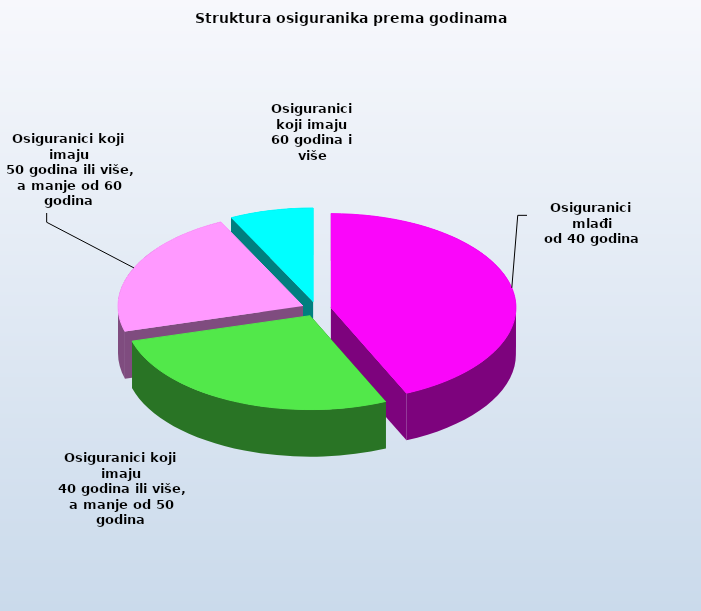
| Category | Series 0 |
|---|---|
| Osiguranici mlađi
od 40 godina | 692591 |
| Osiguranici koji imaju
 40 godina ili više, a manje od 50 godina | 437161 |
| Osiguranici koji imaju
 50 godina ili više, a manje od 60 godina | 352771 |
| Osiguranici koji imaju
60 godina i više | 116987 |